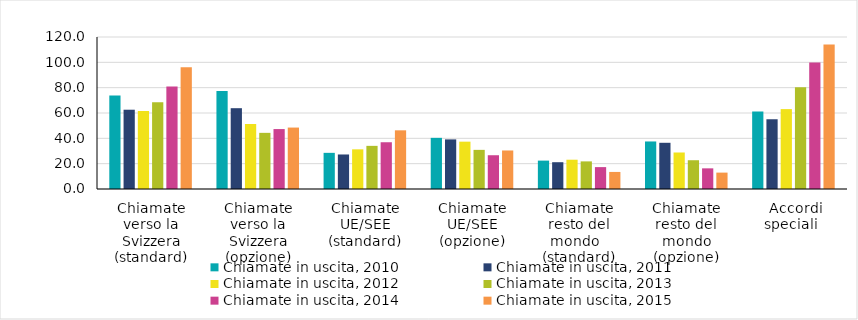
| Category | Chiamate in uscita, 2010 | Chiamate in uscita, 2011 | Chiamate in uscita, 2012 | Chiamate in uscita, 2013 | Chiamate in uscita, 2014 | Chiamate in uscita, 2015 |
|---|---|---|---|---|---|---|
| Chiamate verso la Svizzera (standard) | 73.774 | 62.591 | 61.599 | 68.448 | 80.885 | 96.073 |
| Chiamate verso la Svizzera (opzione) | 77.326 | 63.793 | 51.308 | 44.329 | 47.316 | 48.507 |
| Chiamate UE/SEE (standard) | 28.543 | 27.257 | 31.313 | 34.06 | 36.916 | 46.323 |
| Chiamate UE/SEE (opzione) | 40.383 | 39.164 | 37.376 | 30.894 | 26.656 | 30.41 |
| Chiamate resto del mondo   (standard) | 22.414 | 21.149 | 23.121 | 21.799 | 17.282 | 13.47 |
| Chiamate resto del mondo (opzione) | 37.53 | 36.482 | 28.821 | 22.713 | 16.304 | 12.94 |
|  Accordi speciali  | 61.188 | 55.062 | 63.073 | 80.293 | 99.813 | 114.141 |